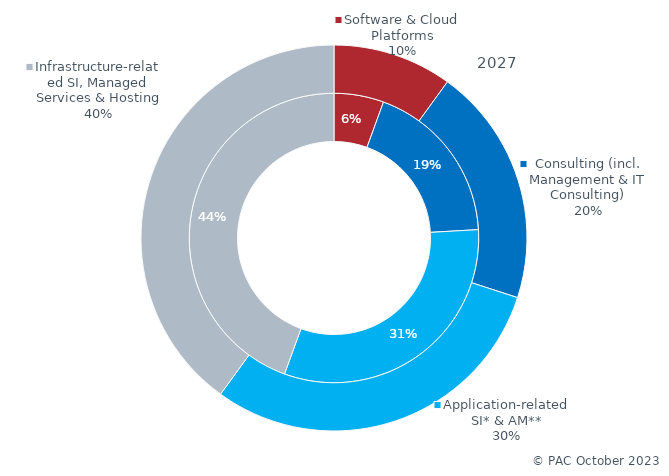
| Category | 2023 | 2027 |
|---|---|---|
| Software & Cloud Platforms | 3 | 7 |
| Consulting (incl. Management & IT Consulting) | 10 | 14 |
| Application-related SI* & AM** | 17 | 21 |
| Infrastructure-related SI, Managed Services & Hosting | 24 | 28 |